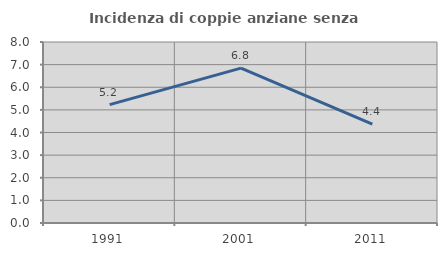
| Category | Incidenza di coppie anziane senza figli  |
|---|---|
| 1991.0 | 5.233 |
| 2001.0 | 6.845 |
| 2011.0 | 4.366 |